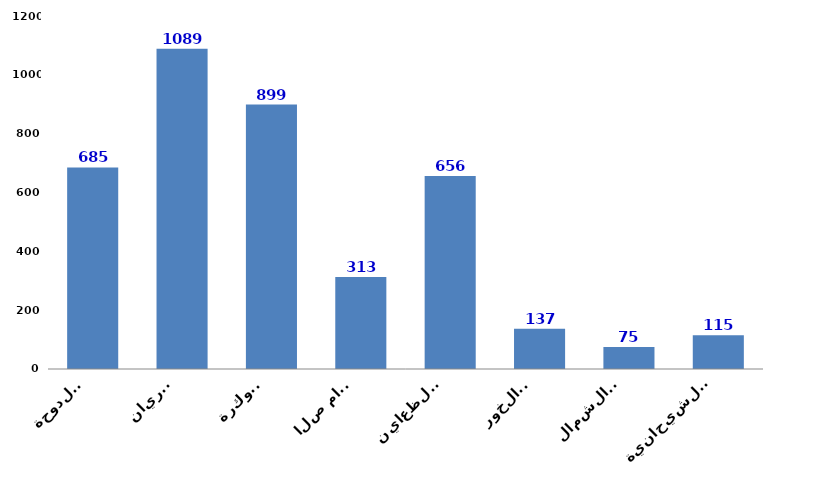
| Category | Series 0 |
|---|---|
| الدوحة
Doha | 685 |
| الريان
Rayyan | 1089 |
| الوكرة
Wakrah | 899 |
| ام صلال
Umm Slal | 313 |
| الظعاين
Al-Daayen | 656 |
| الخور
Al-Khor | 137 |
| الشمال
Al-Shamal | 75 |
| الشيحانية
Al-Shahhaniya | 115 |